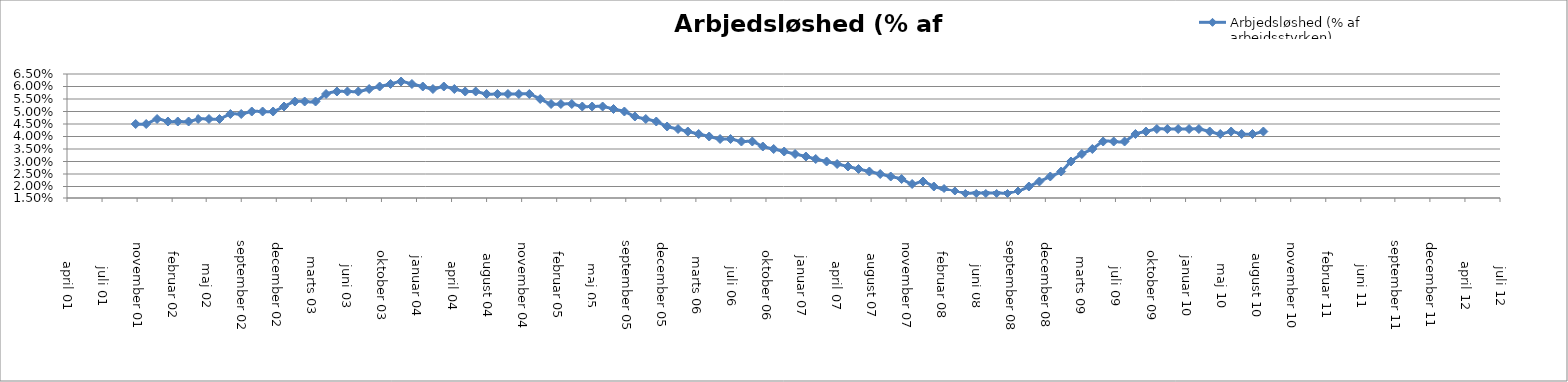
| Category | Arbjedsløshed (% af arbejdsstyrken) |
|---|---|
| 37196.0 | 0.045 |
| 37226.0 | 0.045 |
| 37257.0 | 0.047 |
| 37288.0 | 0.046 |
| 37316.0 | 0.046 |
| 37347.0 | 0.046 |
| 37377.0 | 0.047 |
| 37408.0 | 0.047 |
| 37438.0 | 0.047 |
| 37469.0 | 0.049 |
| 37500.0 | 0.049 |
| 37530.0 | 0.05 |
| 37561.0 | 0.05 |
| 37591.0 | 0.05 |
| 37622.0 | 0.052 |
| 37653.0 | 0.054 |
| 37681.0 | 0.054 |
| 37712.0 | 0.054 |
| 37742.0 | 0.057 |
| 37773.0 | 0.058 |
| 37803.0 | 0.058 |
| 37834.0 | 0.058 |
| 37865.0 | 0.059 |
| 37895.0 | 0.06 |
| 37926.0 | 0.061 |
| 37956.0 | 0.062 |
| 37987.0 | 0.061 |
| 38018.0 | 0.06 |
| 38047.0 | 0.059 |
| 38078.0 | 0.06 |
| 38108.0 | 0.059 |
| 38139.0 | 0.058 |
| 38169.0 | 0.058 |
| 38200.0 | 0.057 |
| 38231.0 | 0.057 |
| 38261.0 | 0.057 |
| 38292.0 | 0.057 |
| 38322.0 | 0.057 |
| 38353.0 | 0.055 |
| 38384.0 | 0.053 |
| 38412.0 | 0.053 |
| 38443.0 | 0.053 |
| 38473.0 | 0.052 |
| 38504.0 | 0.052 |
| 38534.0 | 0.052 |
| 38565.0 | 0.051 |
| 38596.0 | 0.05 |
| 38626.0 | 0.048 |
| 38657.0 | 0.047 |
| 38687.0 | 0.046 |
| 38718.0 | 0.044 |
| 38749.0 | 0.043 |
| 38777.0 | 0.042 |
| 38808.0 | 0.041 |
| 38838.0 | 0.04 |
| 38869.0 | 0.039 |
| 38899.0 | 0.039 |
| 38930.0 | 0.038 |
| 38961.0 | 0.038 |
| 38991.0 | 0.036 |
| 39022.0 | 0.035 |
| 39052.0 | 0.034 |
| 39083.0 | 0.033 |
| 39114.0 | 0.032 |
| 39142.0 | 0.031 |
| 39173.0 | 0.03 |
| 39203.0 | 0.029 |
| 39234.0 | 0.028 |
| 39264.0 | 0.027 |
| 39295.0 | 0.026 |
| 39326.0 | 0.025 |
| 39356.0 | 0.024 |
| 39387.0 | 0.023 |
| 39417.0 | 0.021 |
| 39448.0 | 0.022 |
| 39479.0 | 0.02 |
| 39508.0 | 0.019 |
| 39539.0 | 0.018 |
| 39569.0 | 0.017 |
| 39600.0 | 0.017 |
| 39630.0 | 0.017 |
| 39661.0 | 0.017 |
| 39692.0 | 0.017 |
| 39722.0 | 0.018 |
| 39753.0 | 0.02 |
| 39783.0 | 0.022 |
| 39814.0 | 0.024 |
| 39845.0 | 0.026 |
| 39873.0 | 0.03 |
| 39904.0 | 0.033 |
| 39934.0 | 0.035 |
| 39965.0 | 0.038 |
| 39995.0 | 0.038 |
| 40026.0 | 0.038 |
| 40057.0 | 0.041 |
| 40087.0 | 0.042 |
| 40118.0 | 0.043 |
| 40148.0 | 0.043 |
| 40179.0 | 0.043 |
| 40210.0 | 0.043 |
| 40238.0 | 0.043 |
| 40269.0 | 0.042 |
| 40299.0 | 0.041 |
| 40330.0 | 0.042 |
| 40360.0 | 0.041 |
| 40391.0 | 0.041 |
| 40422.0 | 0.042 |